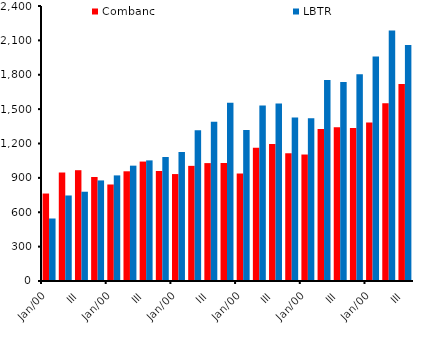
| Category | Combanc | LBTR |
|---|---|---|
| 12 | 763.394 | 545.441 |
|  | 946.801 | 746.341 |
| III | 966.999 | 779.142 |
|  | 907.689 | 877.806 |
| 13 | 842.243 | 921.631 |
|  | 957.405 | 1006.553 |
| III | 1042.402 | 1052.704 |
|  | 960.24 | 1081.956 |
| 14 | 933.24 | 1125.121 |
|  | 1004.895 | 1316.531 |
| III | 1028.894 | 1390.647 |
|  | 1029.635 | 1554.982 |
| 15 | 938.065 | 1317.541 |
|  | 1162.359 | 1532.332 |
| III | 1195.389 | 1548.278 |
|  | 1114.736 | 1426.953 |
| 16 | 1103.844 | 1419.877 |
|  | 1327.633 | 1754.462 |
| III | 1342.336 | 1737.323 |
|  | 1334.439 | 1804.153 |
| 17 | 1383.666 | 1959.742 |
|  | 1550.876 | 2185.789 |
| III | 1719.992 | 2060.088 |